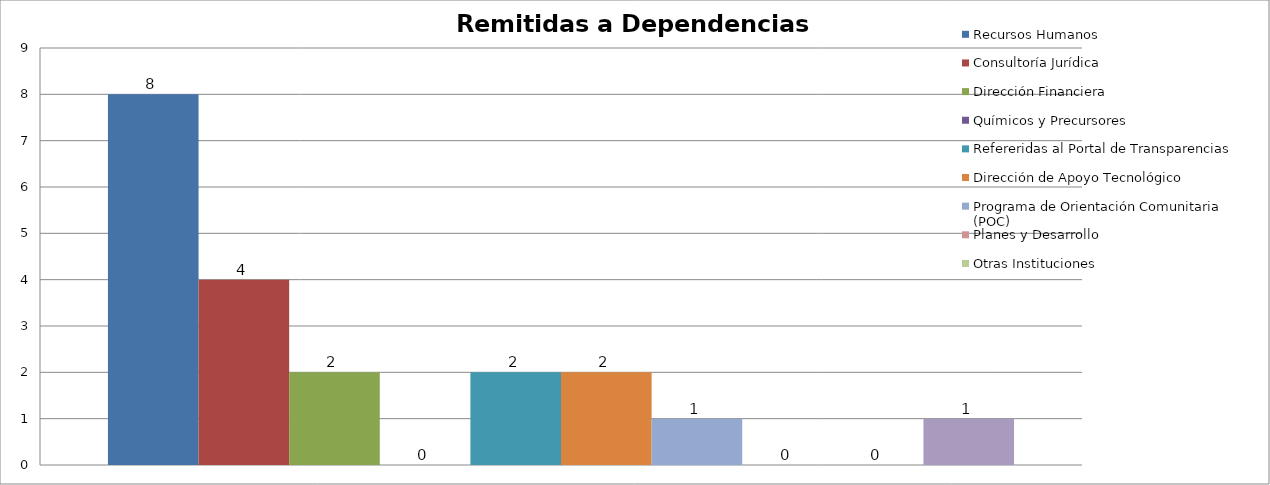
| Category | Recursos Humanos  | Consultoría Jurídica | Dirección Financiera | Químicos y Precursores | Refereridas al Portal de Transparencias | Dirección de Apoyo Tecnológico | Programa de Orientación Comunitaria (POC) | Planes y Desarrollo | Otras Instituciones | Incompleta |
|---|---|---|---|---|---|---|---|---|---|---|
| 0 | 8 | 4 | 2 | 0 | 2 | 2 | 1 | 0 | 0 | 1 |